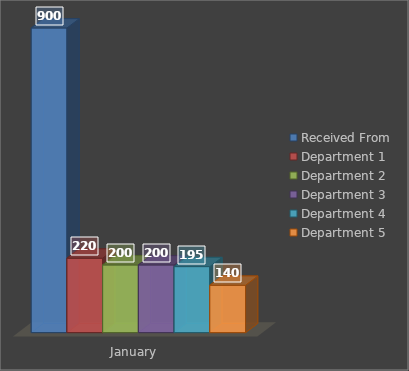
| Category | Received From | Department 1 | Department 2 | Department 3 | Department 4 | Department 5 |
|---|---|---|---|---|---|---|
| January | 900 | 220 | 200 | 200 | 195 | 140 |